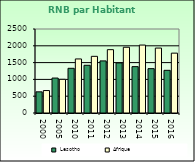
| Category | Lesotho | Afrique                        |
|---|---|---|
| 2000.0 | 630 | 668.557 |
| 2005.0 | 1040 | 1002.896 |
| 2010.0 | 1330 | 1608.999 |
| 2011.0 | 1420 | 1686.521 |
| 2012.0 | 1550 | 1885.129 |
| 2013.0 | 1490 | 1956.671 |
| 2014.0 | 1380 | 2022.289 |
| 2015.0 | 1320 | 1932.283 |
| 2016.0 | 1270 | 1781.415 |